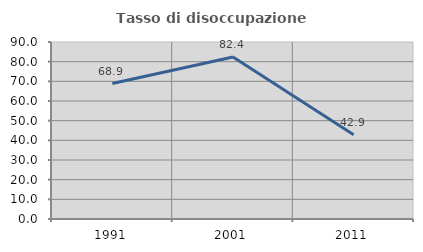
| Category | Tasso di disoccupazione giovanile  |
|---|---|
| 1991.0 | 68.889 |
| 2001.0 | 82.353 |
| 2011.0 | 42.857 |